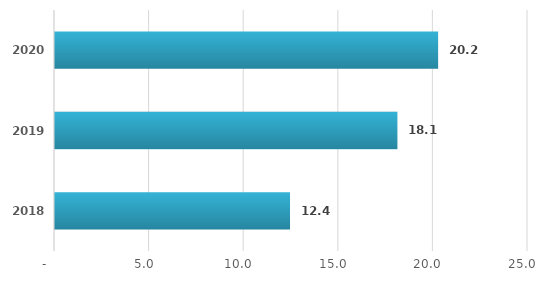
| Category | Series 0 |
|---|---|
| 2018.0 | 12.422 |
| 2019.0 | 18.098 |
| 2020.0 | 20.25 |